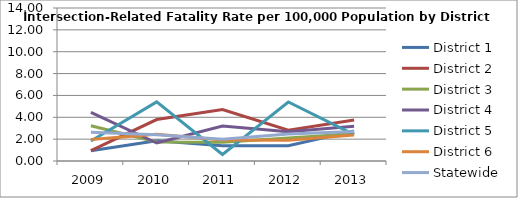
| Category | District 1 | District 2 | District 3 | District 4 | District 5 | District 6 | Statewide |
|---|---|---|---|---|---|---|---|
| 2009.0 | 0.936 | 0.957 | 3.232 | 4.445 | 1.823 | 1.976 | 2.625 |
| 2010.0 | 1.859 | 3.795 | 1.75 | 1.645 | 5.404 | 2.445 | 2.394 |
| 2011.0 | 1.398 | 4.707 | 1.713 | 3.208 | 0.598 | 1.911 | 1.987 |
| 2012.0 | 1.392 | 2.817 | 2.112 | 2.671 | 5.397 | 1.909 | 2.461 |
| 2013.0 | 2.758 | 3.753 | 2.492 | 3.177 | 2.408 | 2.375 | 2.695 |